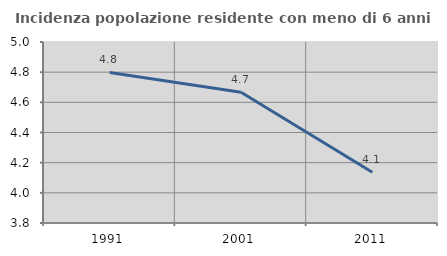
| Category | Incidenza popolazione residente con meno di 6 anni |
|---|---|
| 1991.0 | 4.798 |
| 2001.0 | 4.667 |
| 2011.0 | 4.136 |